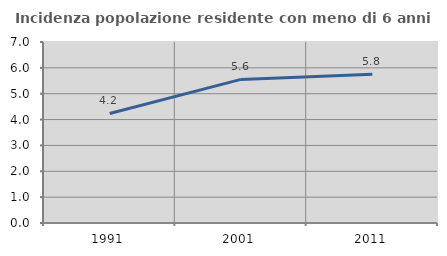
| Category | Incidenza popolazione residente con meno di 6 anni |
|---|---|
| 1991.0 | 4.236 |
| 2001.0 | 5.554 |
| 2011.0 | 5.756 |